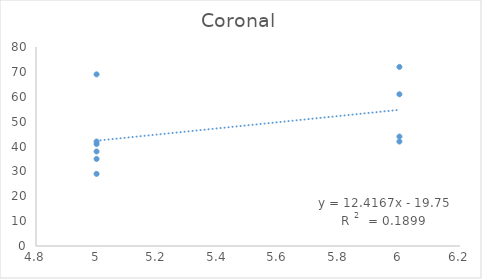
| Category | Coronal |
|---|---|
| 5.0 | 29 |
| 6.0 | 42 |
| 5.0 | 42 |
| 6.0 | 61 |
| 6.0 | 44 |
| 6.0 | 72 |
| 5.0 | 35 |
| 5.0 | 38 |
| 5.0 | 41 |
| 5.0 | 69 |